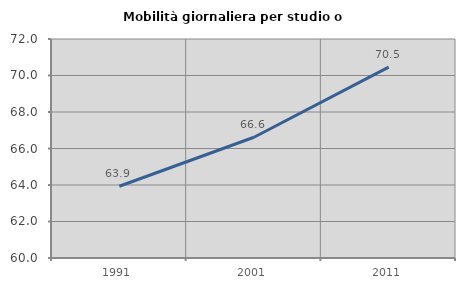
| Category | Mobilità giornaliera per studio o lavoro |
|---|---|
| 1991.0 | 63.93 |
| 2001.0 | 66.617 |
| 2011.0 | 70.455 |